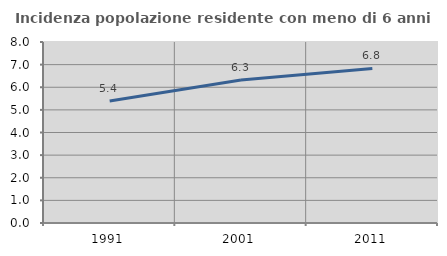
| Category | Incidenza popolazione residente con meno di 6 anni |
|---|---|
| 1991.0 | 5.394 |
| 2001.0 | 6.324 |
| 2011.0 | 6.832 |